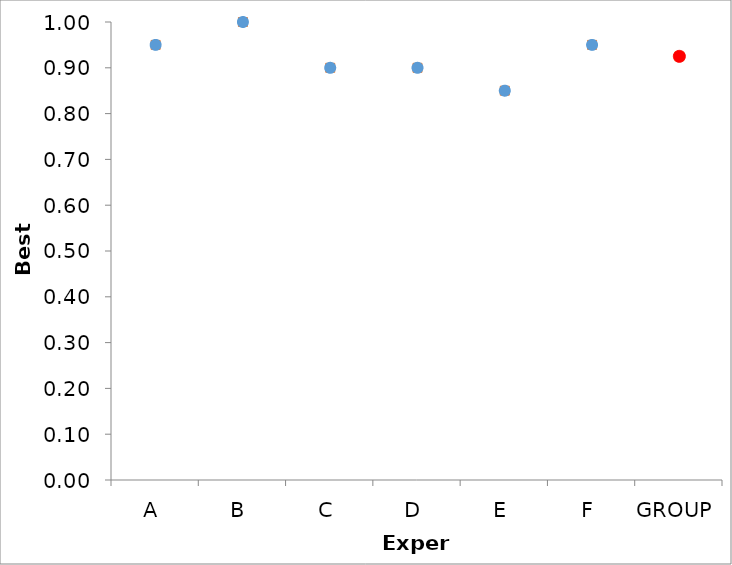
| Category | Series 1 | Series 0 |
|---|---|---|
| A | 0.95 | 0.95 |
| B | 1 | 1 |
| C | 0.9 | 0.9 |
| D | 0.9 | 0.9 |
| E | 0.85 | 0.85 |
| F | 0.95 | 0.95 |
| GROUP | 0.925 | 0.925 |